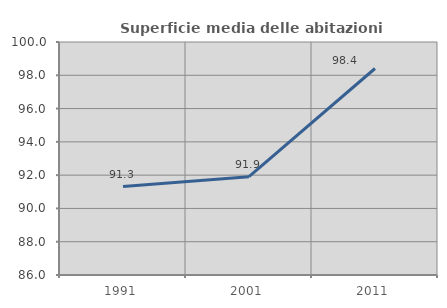
| Category | Superficie media delle abitazioni occupate |
|---|---|
| 1991.0 | 91.312 |
| 2001.0 | 91.91 |
| 2011.0 | 98.408 |